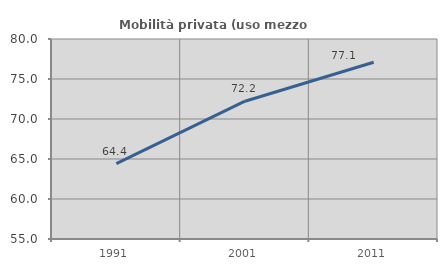
| Category | Mobilità privata (uso mezzo privato) |
|---|---|
| 1991.0 | 64.432 |
| 2001.0 | 72.226 |
| 2011.0 | 77.098 |